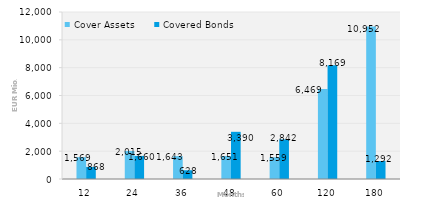
| Category | Cover Assets | Covered Bonds |
|---|---|---|
| 12.0 | 1568.981 | 868 |
| 24.0 | 2014.528 | 1659.5 |
| 36.0 | 1642.648 | 628 |
| 48.0 | 1650.845 | 3390.475 |
| 60.0 | 1558.744 | 2841.5 |
| 120.0 | 6469.012 | 8169.247 |
| 180.0 | 10952.292 | 1292 |